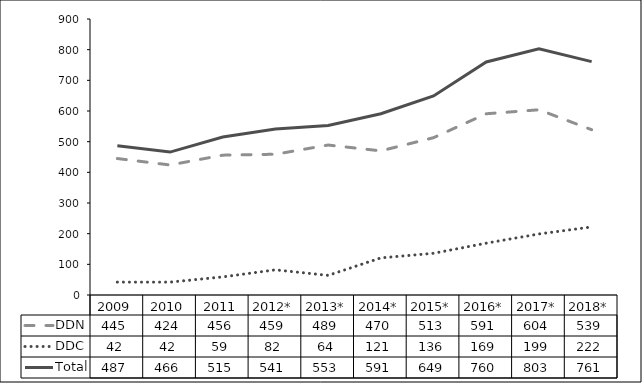
| Category | DDN | DDC | Total |
|---|---|---|---|
| 2009 | 445 | 42 | 487 |
| 2010 | 424 | 42 | 466 |
| 2011 | 456 | 59 | 515 |
| 2012* | 459 | 82 | 541 |
| 2013* | 489 | 64 | 553 |
| 2014* | 470 | 121 | 591 |
| 2015* | 513 | 136 | 649 |
| 2016* | 591 | 169 | 760 |
| 2017* | 604 | 199 | 803 |
| 2018* | 539 | 222 | 761 |